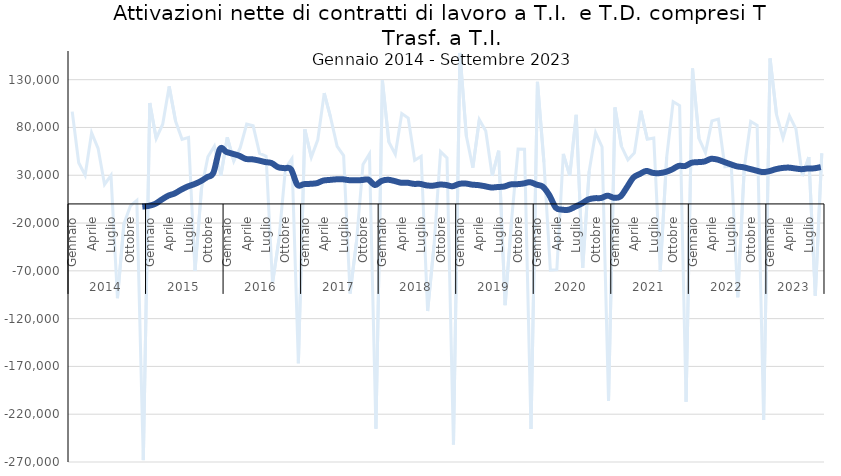
| Category | T.I. e T.D. compresi i Trasf. A T.I. |
|---|---|
| 0 | 96588 |
| 1 | 43151 |
| 2 | 30122 |
| 3 | 74379 |
| 4 | 58182 |
| 5 | 20431 |
| 6 | 29887 |
| 7 | -98641 |
| 8 | -20905 |
| 9 | -2100 |
| 10 | 3714 |
| 11 | -268020 |
| 12 | 105534 |
| 13 | 68499 |
| 14 | 83378 |
| 15 | 122984 |
| 16 | 86478 |
| 17 | 67574 |
| 18 | 69576 |
| 19 | -69980 |
| 20 | 15809 |
| 21 | 49410 |
| 22 | 60342 |
| 23 | 29402 |
| 24 | 69700 |
| 25 | 44705 |
| 26 | 58861 |
| 27 | 83444 |
| 28 | 81749 |
| 29 | 52769 |
| 30 | 49944 |
| 31 | -82666 |
| 32 | -36544 |
| 33 | 37215 |
| 34 | 47343 |
| 35 | -166691 |
| 36 | 78065 |
| 37 | 48824 |
| 38 | 67055 |
| 39 | 115961 |
| 40 | 90047 |
| 41 | 60224 |
| 42 | 50560 |
| 43 | -93754 |
| 44 | -39094 |
| 45 | 41293 |
| 46 | 52331 |
| 47 | -235094 |
| 48 | 129259 |
| 49 | 64767 |
| 50 | 51937 |
| 51 | 94489 |
| 52 | 89830 |
| 53 | 45602 |
| 54 | 49836 |
| 55 | -112035 |
| 56 | -42914 |
| 57 | 54767 |
| 58 | 48048 |
| 59 | -251784 |
| 60 | 158009 |
| 61 | 70671 |
| 62 | 37996 |
| 63 | 88133 |
| 64 | 76327 |
| 65 | 29462 |
| 66 | 55655 |
| 67 | -105856 |
| 68 | -16471 |
| 69 | 57391 |
| 70 | 57183 |
| 71 | -235408 |
| 72 | 127725 |
| 73 | 43727 |
| 74 | -69210 |
| 75 | -68774 |
| 76 | 52294 |
| 77 | 29540 |
| 78 | 93119 |
| 79 | -66842 |
| 80 | 34115 |
| 81 | 74610 |
| 82 | 59591 |
| 83 | -205924 |
| 84 | 100835 |
| 85 | 60326 |
| 86 | 46088 |
| 87 | 53347 |
| 88 | 97528 |
| 89 | 67621 |
| 90 | 68952 |
| 91 | -70469 |
| 92 | 48920 |
| 93 | 106842 |
| 94 | 102953 |
| 95 | -206918 |
| 96 | 141594 |
| 97 | 68312 |
| 98 | 53633 |
| 99 | 86911 |
| 100 | 88753 |
| 101 | 38832 |
| 102 | 39933 |
| 103 | -97671 |
| 104 | 37212 |
| 105 | 86219 |
| 106 | 82303 |
| 107 | -226121 |
| 108 | 152135 |
| 109 | 93344 |
| 110 | 68976 |
| 111 | 92239 |
| 112 | 78520 |
| 113 | 29166 |
| 114 | 48957 |
| 115 | -95916 |
| 116 | 52879 |